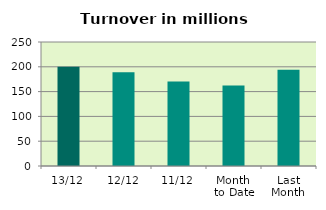
| Category | Series 0 |
|---|---|
| 13/12 | 199.952 |
| 12/12 | 189.079 |
| 11/12 | 170.442 |
| Month 
to Date | 162.06 |
| Last
Month | 193.997 |